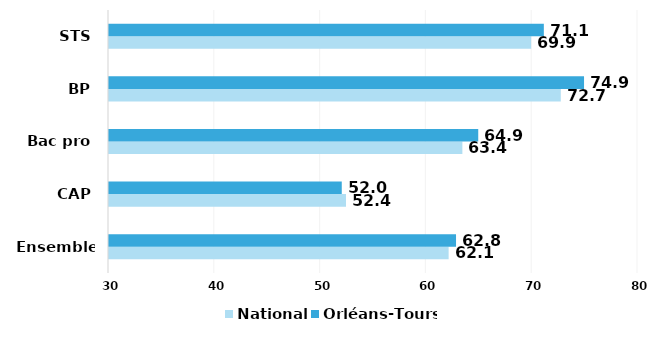
| Category | National | Orléans-Tours |
|---|---|---|
| Ensemble* | 62.1 | 62.8 |
| CAP | 52.4 | 52 |
| Bac pro | 63.4 | 64.9 |
| BP | 72.7 | 74.9 |
| STS | 69.9 | 71.1 |